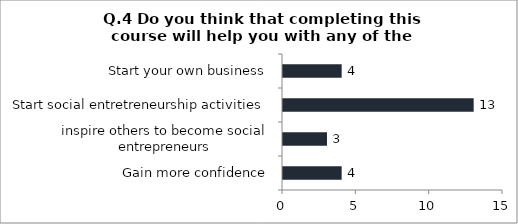
| Category | Q.4 Do you think that completing this course will help you with any of the followoing ? |
|---|---|
| Gain more confidence | 4 |
| inspire others to become social entrepreneurs | 3 |
| Start social entretreneurship activities | 13 |
| Start your own business | 4 |